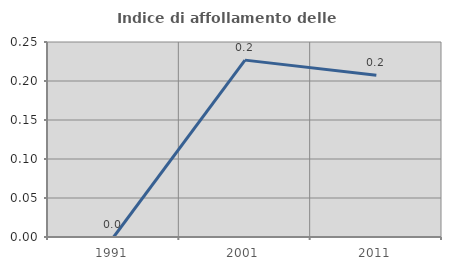
| Category | Indice di affollamento delle abitazioni  |
|---|---|
| 1991.0 | 0 |
| 2001.0 | 0.227 |
| 2011.0 | 0.207 |